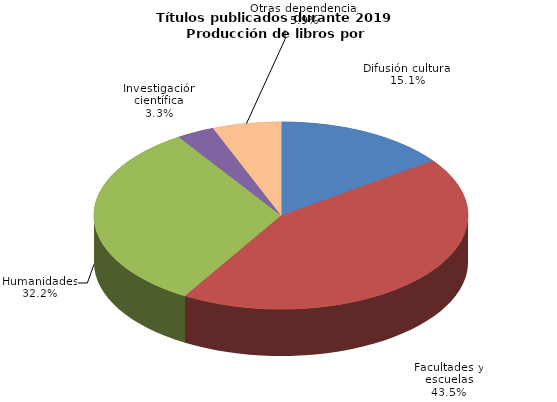
| Category | Series 0 |
|---|---|
| Difusión cultural | 349 |
| Facultades y escuelas | 1008 |
| Humanidades | 747 |
| Investigación científica | 76 |
| Otras dependencias | 137 |